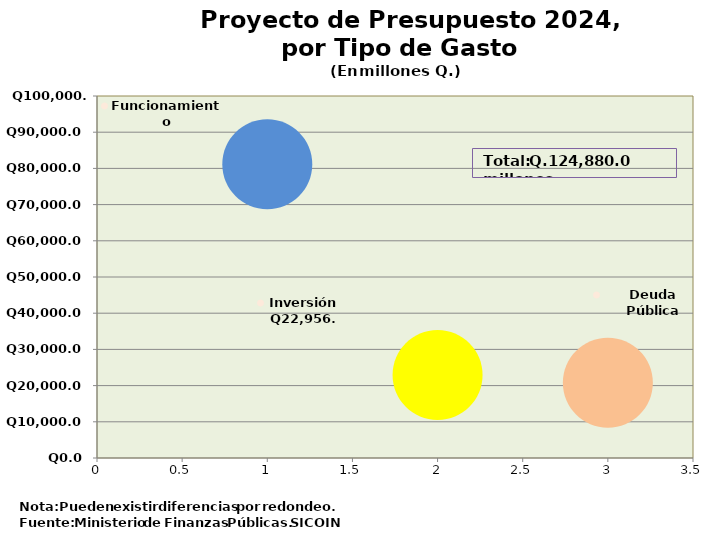
| Category | Recomendado 2022 |
|---|---|
| 0 | 81144.8 |
| 1 | 22956.8 |
| 2 | 20778.4 |